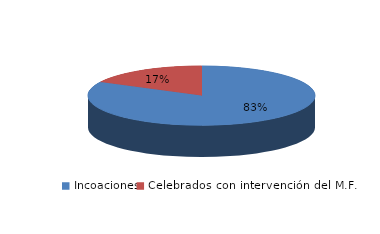
| Category | Series 0 |
|---|---|
| Incoaciones | 1787 |
| Celebrados con intervención del M.F. | 377 |